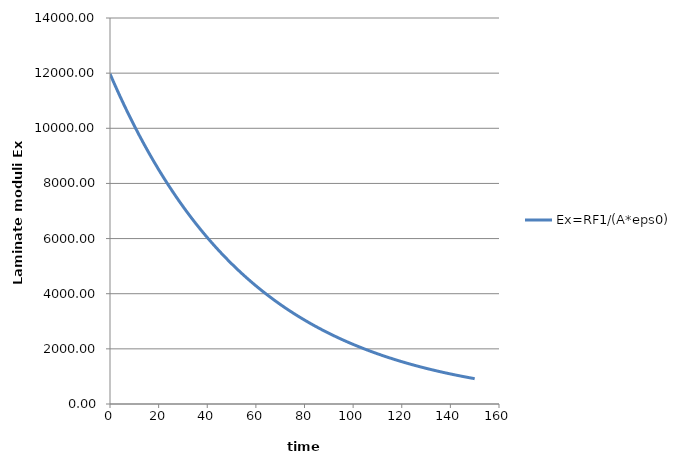
| Category | Ex=RF1/(A*eps0) |
|---|---|
| 0.001 | 11974.578 |
| 2.001 | 11571.644 |
| 4.001 | 11182.222 |
| 6.001 | 10805.867 |
| 8.001 | 10442.222 |
| 10.001 | 10090.844 |
| 12.001 | 9751.2 |
| 14.001 | 9423.111 |
| 16.001 | 9105.956 |
| 18.001 | 8799.511 |
| 20.001 | 8503.378 |
| 22.001 | 8217.209 |
| 24.001 | 7940.676 |
| 26.001 | 7673.449 |
| 28.001 | 7415.218 |
| 30.001 | 7165.671 |
| 32.001 | 6924.524 |
| 34.001 | 6691.493 |
| 36.001 | 6466.302 |
| 38.001 | 6248.693 |
| 40.001 | 6038.4 |
| 42.001 | 5835.191 |
| 44.001 | 5638.818 |
| 46.001 | 5449.058 |
| 48.001 | 5265.68 |
| 50.001 | 5088.471 |
| 52.001 | 4917.227 |
| 54.001 | 4751.751 |
| 56.001 | 4591.84 |
| 58.001 | 4437.307 |
| 60.001 | 4287.982 |
| 62.001 | 4143.68 |
| 64.001 | 4004.231 |
| 66.001 | 3869.476 |
| 68.001 | 3739.253 |
| 70.001 | 3613.413 |
| 72.001 | 3491.813 |
| 74.001 | 3374.302 |
| 76.001 | 3260.747 |
| 78.001 | 3151.013 |
| 80.001 | 3044.969 |
| 82.001 | 2942.498 |
| 84.001 | 2843.476 |
| 86.001 | 2747.787 |
| 88.001 | 2655.316 |
| 90.001 | 2565.956 |
| 92.001 | 2479.6 |
| 94.001 | 2396.151 |
| 96.001 | 2315.52 |
| 98.001 | 2237.591 |
| 100.001 | 2162.293 |
| 102.001 | 2089.52 |
| 104.001 | 2019.2 |
| 106.001 | 1951.253 |
| 108.001 | 1885.582 |
| 110.001 | 1822.133 |
| 112.001 | 1760.809 |
| 114.001 | 1701.556 |
| 116.001 | 1644.293 |
| 118.001 | 1588.951 |
| 120.001 | 1535.484 |
| 122.001 | 1483.804 |
| 124.001 | 1433.876 |
| 126.001 | 1385.618 |
| 128.001 | 1338.987 |
| 130.001 | 1293.929 |
| 132.001 | 1250.382 |
| 134.001 | 1208.302 |
| 136.001 | 1167.644 |
| 138.001 | 1128.347 |
| 140.001 | 1090.373 |
| 142.001 | 1053.68 |
| 144.001 | 1018.222 |
| 146.001 | 983.956 |
| 148.001 | 950.836 |
| 150.001 | 918.844 |